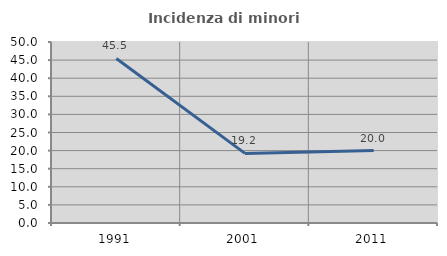
| Category | Incidenza di minori stranieri |
|---|---|
| 1991.0 | 45.455 |
| 2001.0 | 19.231 |
| 2011.0 | 20 |